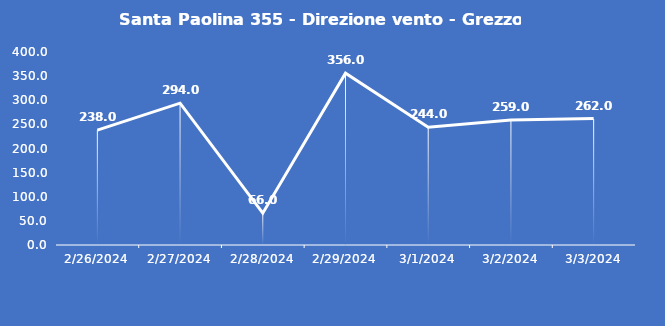
| Category | Santa Paolina 355 - Direzione vento - Grezzo (°N) |
|---|---|
| 2/26/24 | 238 |
| 2/27/24 | 294 |
| 2/28/24 | 66 |
| 2/29/24 | 356 |
| 3/1/24 | 244 |
| 3/2/24 | 259 |
| 3/3/24 | 262 |